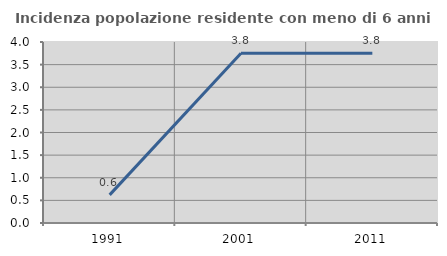
| Category | Incidenza popolazione residente con meno di 6 anni |
|---|---|
| 1991.0 | 0.621 |
| 2001.0 | 3.75 |
| 2011.0 | 3.75 |